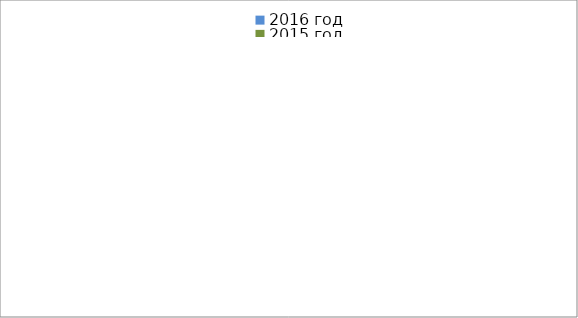
| Category | 2016 год | 2015 год |
|---|---|---|
|  - поджог | 30 | 23 |
|  - неосторожное обращение с огнём | 22 | 44 |
|  - НПТЭ электрооборудования | 17 | 9 |
|  - НПУ и Э печей | 30 | 36 |
|  - НПУ и Э транспортных средств | 24 | 36 |
|   -Шалость с огнем детей | 6 | 3 |
|  -НППБ при эксплуатации эл.приборов | 11 | 12 |
|  - курение | 12 | 19 |
| - прочие | 67 | 67 |
| - не установленные причины | 12 | 9 |